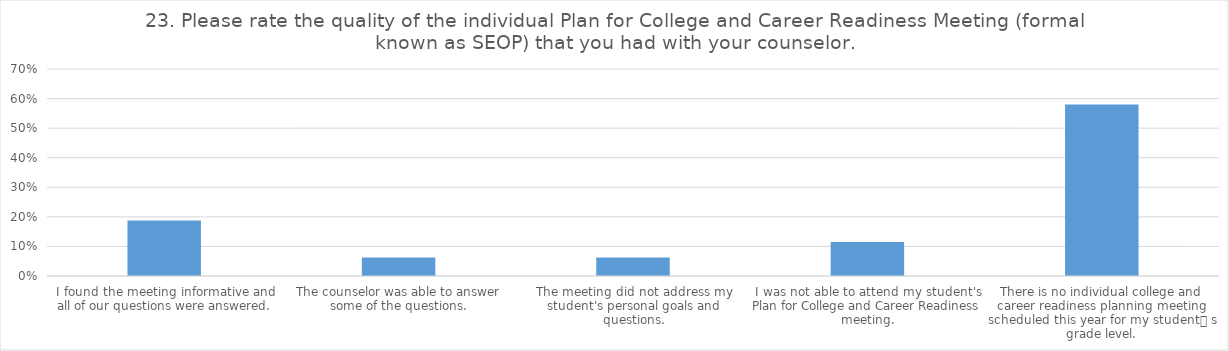
| Category | Percentage |
|---|---|
| I found the meeting informative and all of our questions were answered. | 0.188 |
| The counselor was able to answer some of the questions. | 0.062 |
| The meeting did not address my student's personal goals and questions. | 0.062 |
| I was not able to attend my student's Plan for College and Career Readiness meeting. | 0.115 |
| There is no individual college and career readiness planning meeting scheduled this year for my student_x0019_ s grade level. | 0.58 |